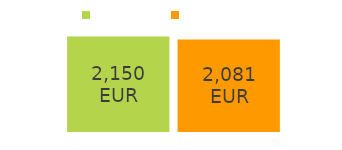
| Category | ieskaitīta | atskaitīta |
|---|---|---|
| nauda ieskaitīta: | 2150 | 2081 |